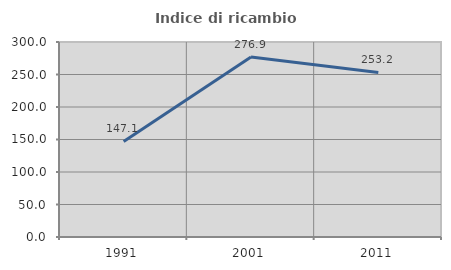
| Category | Indice di ricambio occupazionale  |
|---|---|
| 1991.0 | 147.059 |
| 2001.0 | 276.923 |
| 2011.0 | 253.226 |